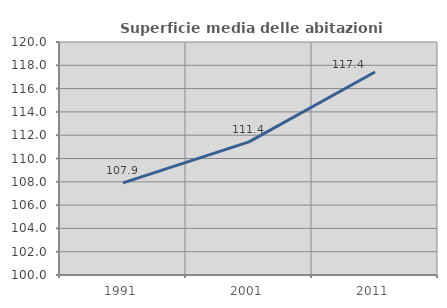
| Category | Superficie media delle abitazioni occupate |
|---|---|
| 1991.0 | 107.907 |
| 2001.0 | 111.431 |
| 2011.0 | 117.421 |